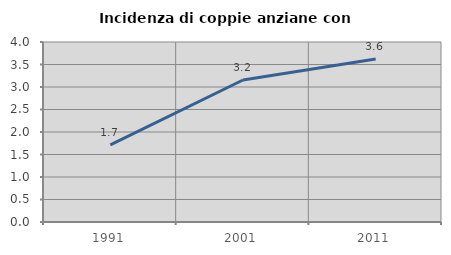
| Category | Incidenza di coppie anziane con figli |
|---|---|
| 1991.0 | 1.714 |
| 2001.0 | 3.155 |
| 2011.0 | 3.624 |